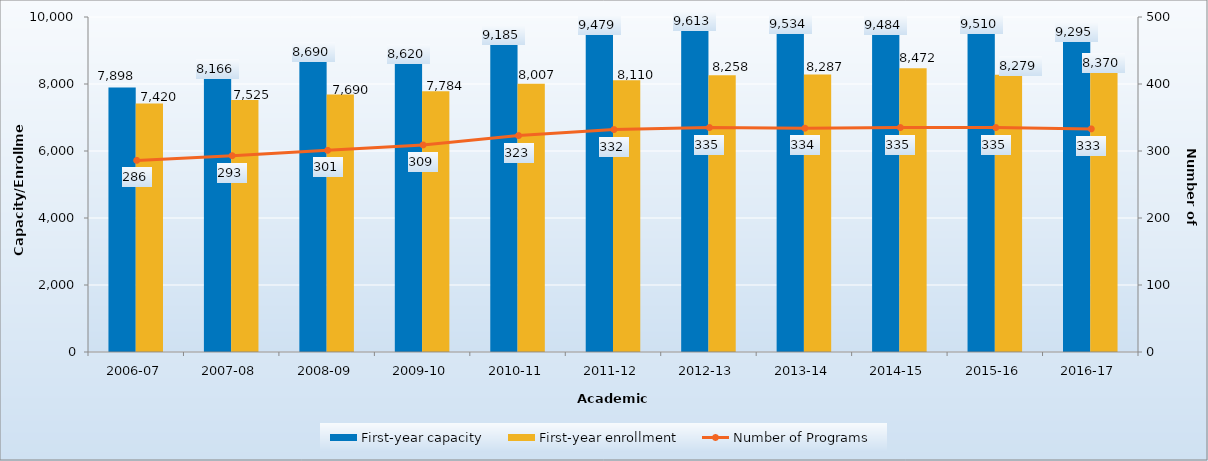
| Category | First-year capacity | First-year enrollment |
|---|---|---|
| 2006-07 | 7898 | 7420 |
| 2007-08 | 8166 | 7525 |
| 2008-09 | 8690 | 7690 |
| 2009-10 | 8620 | 7784 |
| 2010-11 | 9185 | 8007 |
| 2011-12 | 9479 | 8110 |
| 2012-13 | 9613 | 8258 |
| 2013-14 | 9534 | 8287 |
| 2014-15 | 9484 | 8472 |
| 2015-16 | 9510 | 8279 |
| 2016-17 | 9295 | 8370 |